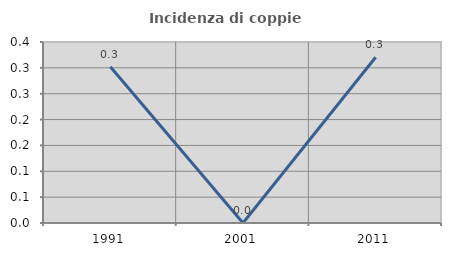
| Category | Incidenza di coppie miste |
|---|---|
| 1991.0 | 0.302 |
| 2001.0 | 0 |
| 2011.0 | 0.321 |